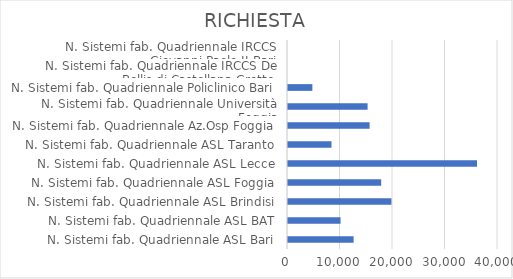
| Category | RICHIESTA |
|---|---|
| N. Sistemi fab. Quadriennale ASL Bari | 12500 |
| N. Sistemi fab. Quadriennale ASL BAT | 10010 |
| N. Sistemi fab. Quadriennale ASL Brindisi | 19700 |
| N. Sistemi fab. Quadriennale ASL Foggia | 17750 |
| N. Sistemi fab. Quadriennale ASL Lecce | 36000 |
| N. Sistemi fab. Quadriennale ASL Taranto | 8285 |
| N. Sistemi fab. Quadriennale Az.Osp Foggia | 15545 |
| N. Sistemi fab. Quadriennale Università Foggia | 15160 |
| N. Sistemi fab. Quadriennale Policlinico Bari | 4640 |
| N. Sistemi fab. Quadriennale IRCCS De Bellis di Castellana Grotte | 0 |
| N. Sistemi fab. Quadriennale IRCCS Giovanni Paolo II Bari | 0 |